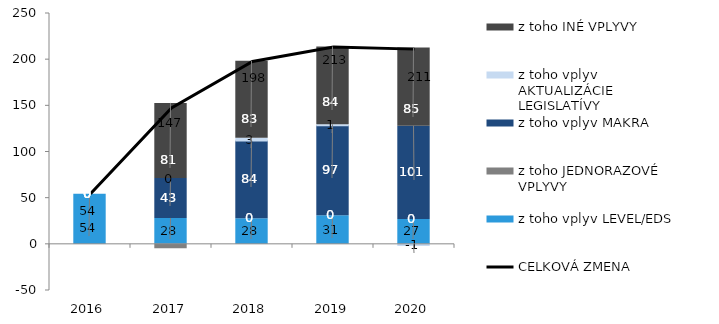
| Category | z toho vplyv LEVEL/EDS | z toho JEDNORAZOVÉ VPLYVY | z toho vplyv MAKRA | z toho vplyv AKTUALIZÁCIE LEGISLATÍVY | z toho INÉ VPLYVY |
|---|---|---|---|---|---|
| 2016.0 | 54.159 | 0 | 0 | 0 | 0 |
| 2017.0 | 28.002 | -4.698 | 43.258 | 0 | 81.357 |
| 2018.0 | 27.631 | 0 | 84.263 | 3.073 | 83.236 |
| 2019.0 | 30.861 | 0 | 97.439 | 1.173 | 84.199 |
| 2020.0 | 26.917 | 0 | 100.893 | -1.38 | 84.922 |